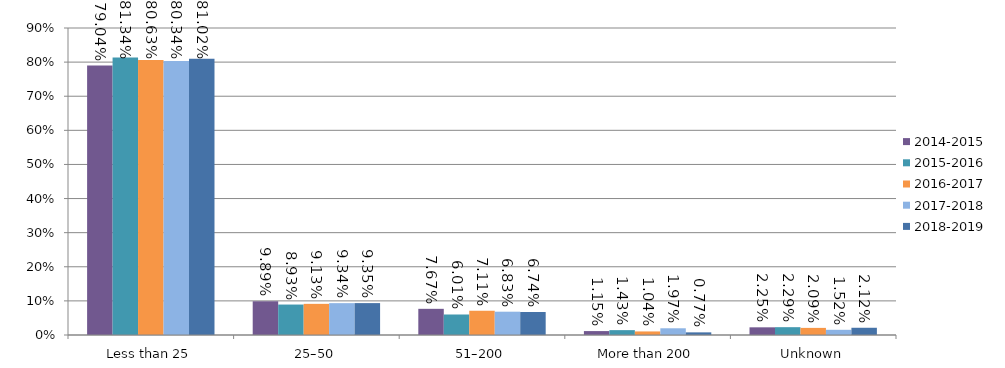
| Category | 2014-2015 | 2015-2016 | 2016-2017 | 2017-2018 | 2018-2019 |
|---|---|---|---|---|---|
| Less than 25 | 0.79 | 0.813 | 0.806 | 0.803 | 0.81 |
| 25–50 | 0.099 | 0.089 | 0.091 | 0.093 | 0.093 |
| 51–200 | 0.077 | 0.06 | 0.071 | 0.068 | 0.067 |
| More than 200 | 0.011 | 0.014 | 0.01 | 0.02 | 0.008 |
| Unknown | 0.023 | 0.023 | 0.021 | 0.015 | 0.021 |